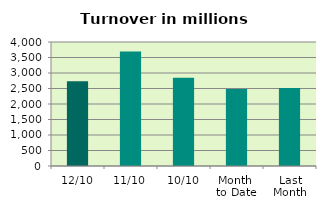
| Category | Series 0 |
|---|---|
| 12/10 | 2735.086 |
| 11/10 | 3694.141 |
| 10/10 | 2843.722 |
| Month 
to Date | 2487.392 |
| Last
Month | 2513.15 |